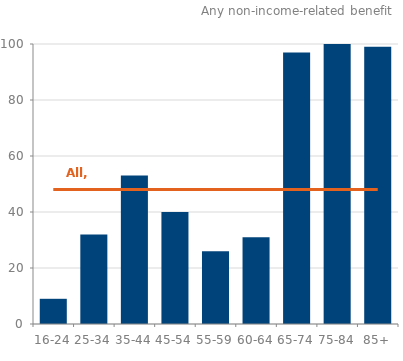
| Category | Series 0 |
|---|---|
| 0 | 9 |
| 1 | 32 |
| 2 | 53 |
| 3 | 40 |
| 4 | 26 |
| 5 | 31 |
| 6 | 97 |
| 7 | 100 |
| 8 | 99 |